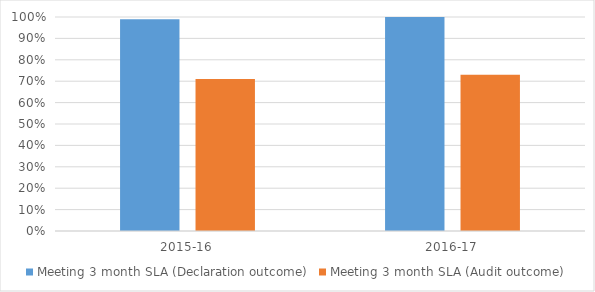
| Category | Meeting 3 month SLA (Declaration outcome) #REF! | Meeting 3 month SLA (Audit outcome) #REF! |
|---|---|---|
| 2015-16 | 0.99 | 0.71 |
| 2016-17 | 1 | 0.73 |